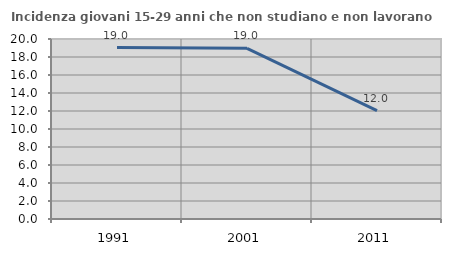
| Category | Incidenza giovani 15-29 anni che non studiano e non lavorano  |
|---|---|
| 1991.0 | 19.048 |
| 2001.0 | 18.966 |
| 2011.0 | 12.037 |